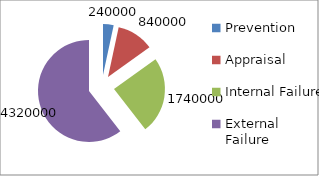
| Category | Series 0 |
|---|---|
| Prevention | 240000 |
| Appraisal | 840000 |
| Internal Failure | 1740000 |
| External Failure | 4320000 |